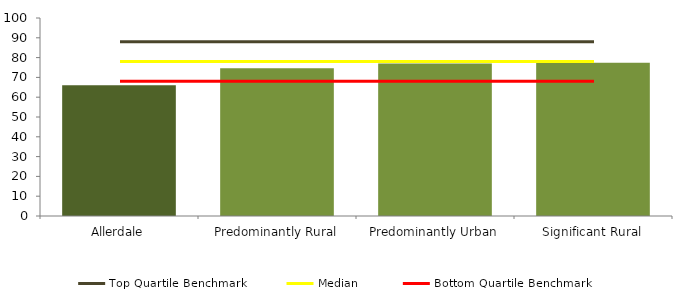
| Category | Series 0 |
|---|---|
| Allerdale | 66 |
| Predominantly Rural | 74.575 |
| Predominantly Urban | 77.067 |
| Significant Rural | 77.37 |